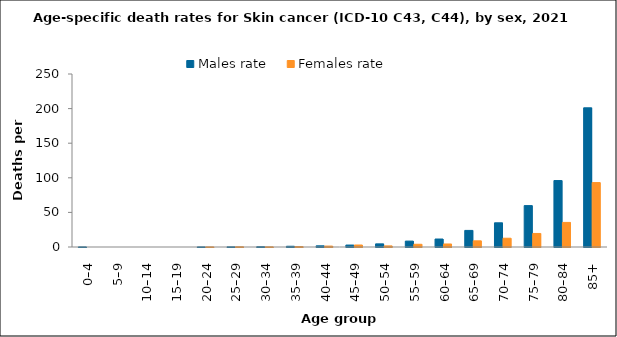
| Category | Males rate | Females rate |
|---|---|---|
| 0–4 | 0.129 | 0 |
| 5–9 | 0 | 0 |
| 10–14 | 0 | 0 |
| 15–19 | 0 | 0 |
| 20–24 | 0.119 | 0.127 |
| 25–29 | 0.218 | 0.332 |
| 30–34 | 0.425 | 0.209 |
| 35–39 | 1.077 | 0.639 |
| 40–44 | 1.716 | 1.312 |
| 45–49 | 2.814 | 2.882 |
| 50–54 | 4.533 | 1.59 |
| 55–59 | 8.524 | 3.934 |
| 60–64 | 11.53 | 4.378 |
| 65–69 | 23.966 | 8.904 |
| 70–74 | 34.974 | 12.667 |
| 75–79 | 59.818 | 19.554 |
| 80–84 | 96.015 | 35.539 |
| 85+ | 201.133 | 93.104 |